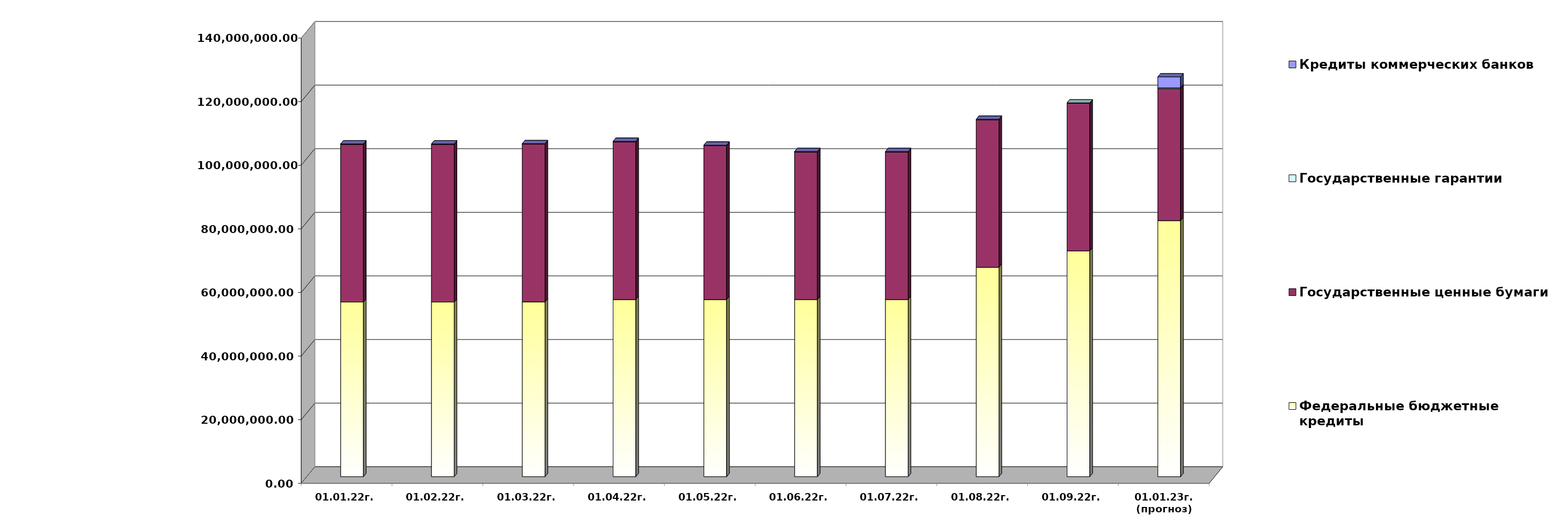
| Category | Федеральные бюджетные кредиты | Государственные ценные бумаги  | Государственные гарантии | Кредиты коммерческих банков |
|---|---|---|---|---|
| 01.01.22г. | 54900618.713 | 49600000 | 141570.67 | 0 |
| 01.02.22г. | 54900618.713 | 49600000 | 139748.87 | 0 |
| 01.03.22г. | 54970753.113 | 49600000 | 139748.87 | 0 |
| 01.04.22г. | 55700753.113 | 49600000 | 139748.87 | 0 |
| 01.05.22г. | 55700753.113 | 48400000 | 138270.964 | 0 |
| 01.06.22г. | 55705077.413 | 46400000 | 138270.964 | 0 |
| 01.07.22г. | 55705077.413 | 46400000 | 138270.964 | 0 |
| 01.08.22г. | 65845099.48 | 46400000 | 134576.199 | 0 |
| 01.09.22г. | 71000838.41 | 46400000 | 134576.199 | 0 |
| 01.01.23г.
(прогноз) | 80529253.9 | 41500000 | 265278.1 | 3434377.3 |